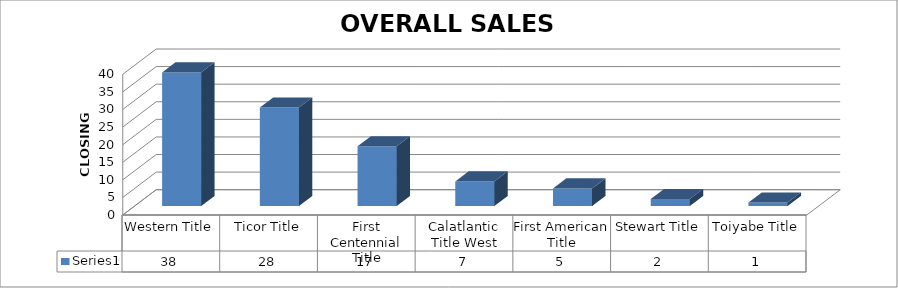
| Category | Series 0 |
|---|---|
| Western Title | 38 |
| Ticor Title | 28 |
| First Centennial Title | 17 |
| Calatlantic Title West | 7 |
| First American Title | 5 |
| Stewart Title | 2 |
| Toiyabe Title | 1 |